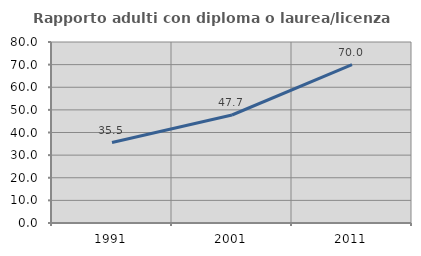
| Category | Rapporto adulti con diploma o laurea/licenza media  |
|---|---|
| 1991.0 | 35.546 |
| 2001.0 | 47.733 |
| 2011.0 | 69.979 |